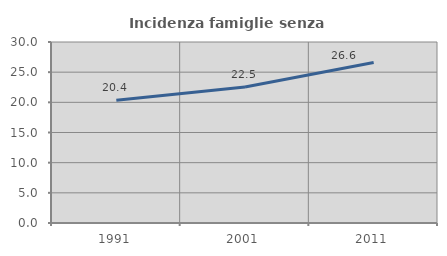
| Category | Incidenza famiglie senza nuclei |
|---|---|
| 1991.0 | 20.351 |
| 2001.0 | 22.541 |
| 2011.0 | 26.609 |